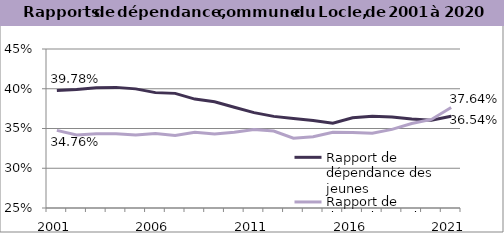
| Category | Rapport de dépendance des jeunes | Rapport de dépendance des personnes âgées |
|---|---|---|
| 2001.0 | 0.398 | 0.348 |
| 2002.0 | 0.399 | 0.342 |
| 2003.0 | 0.401 | 0.343 |
| 2004.0 | 0.402 | 0.344 |
| 2005.0 | 0.4 | 0.342 |
| 2006.0 | 0.395 | 0.344 |
| 2007.0 | 0.394 | 0.341 |
| 2008.0 | 0.387 | 0.345 |
| 2009.0 | 0.384 | 0.343 |
| 2010.0 | 0.377 | 0.345 |
| 2011.0 | 0.37 | 0.349 |
| 2012.0 | 0.365 | 0.347 |
| 2013.0 | 0.363 | 0.338 |
| 2014.0 | 0.36 | 0.34 |
| 2015.0 | 0.357 | 0.345 |
| 2016.0 | 0.363 | 0.345 |
| 2017.0 | 0.365 | 0.344 |
| 2018.0 | 0.365 | 0.349 |
| 2019.0 | 0.362 | 0.356 |
| 2020.0 | 0.36 | 0.361 |
| 2021.0 | 0.365 | 0.376 |